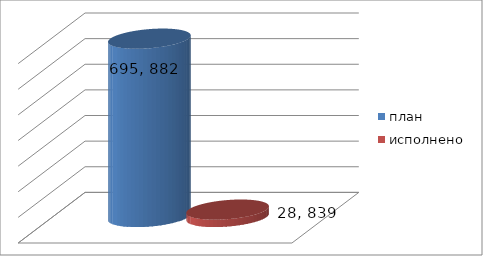
| Category | план | исполнено |
|---|---|---|
| 0 | 695882892.45 | 28839552.83 |